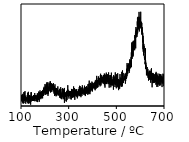
| Category | Series 0 |
|---|---|
| 100.00000000000003 | 0 |
| 100.38936261340189 | 0 |
| 100.77872522680374 | 0 |
| 101.1680878402056 | 0 |
| 101.55745045360747 | 0 |
| 101.94681306700933 | 0 |
| 102.33617568041119 | 0 |
| 102.72553829381305 | 0 |
| 103.11490090721492 | 0 |
| 103.50426352061677 | 0 |
| 103.89362613401863 | 0 |
| 104.28298874742049 | 0 |
| 104.67235136082236 | 0 |
| 105.06171397422422 | 0 |
| 105.45107658762608 | 0 |
| 105.84043920102795 | 0 |
| 106.2298018144298 | 0 |
| 106.61916442783166 | 0 |
| 107.00852704123352 | 0 |
| 107.39788965463539 | 0 |
| 107.78725226803725 | 0 |
| 108.17661488143911 | 0 |
| 108.56597749484096 | 0 |
| 108.95534010824284 | 0 |
| 109.3447027216447 | 0 |
| 109.73406533504655 | 0 |
| 110.12342794844841 | 0 |
| 110.51279056185028 | 0 |
| 110.90215317525214 | 0 |
| 111.291515788654 | 0 |
| 111.68087840205585 | 0 |
| 112.07024101545773 | 0 |
| 112.45960362885958 | 0 |
| 112.84896624226144 | 0 |
| 113.2383288556633 | 0 |
| 113.62769146906517 | 0 |
| 114.01705408246703 | 0 |
| 114.40641669586888 | 0 |
| 114.79577930927074 | 0 |
| 115.18514192267261 | 0 |
| 115.57450453607447 | 0 |
| 115.96386714947633 | 0 |
| 116.35322976287819 | 0 |
| 116.74259237628006 | 0 |
| 117.13195498968192 | 0 |
| 117.52131760308377 | 0 |
| 117.91068021648564 | 0 |
| 118.3000428298875 | 0 |
| 118.68940544328936 | 0 |
| 119.07876805669122 | 0 |
| 119.46813067009309 | 0 |
| 119.85749328349495 | 0 |
| 120.2468558968968 | 0 |
| 120.63621851029866 | 0 |
| 121.02558112370053 | 0 |
| 121.41494373710239 | 0 |
| 121.80430635050425 | 0 |
| 122.1936689639061 | 0 |
| 122.58303157730798 | 0 |
| 122.97239419070984 | 0 |
| 123.36175680411169 | 0 |
| 123.75111941751355 | 0 |
| 124.14048203091542 | 0 |
| 124.52984464431728 | 0 |
| 124.91920725771914 | 0 |
| 125.308569871121 | 0 |
| 125.69793248452287 | 0 |
| 126.08729509792472 | 0 |
| 126.47665771132658 | 0 |
| 126.86602032472844 | 0 |
| 127.25538293813031 | 0 |
| 127.64474555153217 | 0 |
| 128.03410816493403 | 0 |
| 128.42347077833588 | 0 |
| 128.81283339173774 | 0 |
| 129.20219600513963 | 0 |
| 129.59155861854148 | 0 |
| 129.98092123194334 | 0 |
| 130.3702838453452 | 0 |
| 130.75964645874706 | 0 |
| 131.1490090721489 | 0 |
| 131.53837168555077 | 0 |
| 131.92773429895263 | 0 |
| 132.31709691235451 | 0 |
| 132.70645952575637 | 0 |
| 133.09582213915823 | 0 |
| 133.4851847525601 | 0 |
| 133.87454736596194 | 0 |
| 134.2639099793638 | 0 |
| 134.65327259276566 | 0 |
| 135.04263520616752 | 0 |
| 135.4319978195694 | 0 |
| 135.82136043297126 | 0 |
| 136.21072304637312 | 0 |
| 136.60008565977498 | 0 |
| 136.98944827317683 | 0 |
| 137.3788108865787 | 0 |
| 137.76817349998055 | 0 |
| 138.1575361133824 | 0 |
| 138.5468987267843 | 0 |
| 138.93626134018615 | 0 |
| 139.325623953588 | 0 |
| 139.71498656698986 | 0 |
| 140.10434918039172 | 0 |
| 140.49371179379358 | 0 |
| 140.88307440719544 | 0 |
| 141.27243702059732 | 0 |
| 141.66179963399918 | 0 |
| 142.05116224740104 | 0 |
| 142.4405248608029 | 0 |
| 142.82988747420475 | 0 |
| 143.2192500876066 | 0 |
| 143.60861270100847 | 0 |
| 143.99797531441033 | 0 |
| 144.3873379278122 | 0 |
| 144.77670054121407 | 0 |
| 145.16606315461593 | 0 |
| 145.55542576801778 | 0 |
| 145.94478838141964 | 0 |
| 146.3341509948215 | 0 |
| 146.72351360822336 | 0 |
| 147.1128762216252 | 0 |
| 147.5022388350271 | 0 |
| 147.89160144842896 | 0 |
| 148.28096406183082 | 0 |
| 148.67032667523267 | 0 |
| 149.05968928863453 | 0 |
| 149.4490519020364 | 0 |
| 149.83841451543825 | 0 |
| 150.2277771288401 | 0 |
| 150.617139742242 | 0 |
| 151.00650235564385 | 0 |
| 151.3958649690457 | 0 |
| 151.78522758244756 | 0 |
| 152.17459019584942 | 0 |
| 152.56395280925128 | 0 |
| 152.95331542265313 | 0 |
| 153.34267803605502 | 0 |
| 153.73204064945688 | 0 |
| 154.12140326285873 | 0 |
| 154.5107658762606 | 0 |
| 154.90012848966245 | 0 |
| 155.2894911030643 | 0 |
| 155.67885371646616 | 0 |
| 156.06821632986802 | 0 |
| 156.4575789432699 | 0 |
| 156.84694155667177 | 0 |
| 157.23630417007362 | 0 |
| 157.62566678347548 | 0 |
| 158.01502939687734 | 0 |
| 158.4043920102792 | 0 |
| 158.79375462368105 | 0 |
| 159.1831172370829 | 0 |
| 159.5724798504848 | 0 |
| 159.96184246388665 | 0 |
| 160.3512050772885 | 0 |
| 160.74056769069037 | 0 |
| 161.12993030409223 | 0 |
| 161.51929291749408 | 0 |
| 161.90865553089594 | 0 |
| 162.2980181442978 | 0 |
| 162.68738075769969 | 0 |
| 163.07674337110154 | 0 |
| 163.4661059845034 | 0 |
| 163.85546859790526 | 0 |
| 164.24483121130712 | 0 |
| 164.63419382470897 | 0 |
| 165.02355643811083 | 0 |
| 165.41291905151272 | 0 |
| 165.80228166491457 | 0 |
| 166.19164427831643 | 0 |
| 166.5810068917183 | 0 |
| 166.97036950512015 | 0 |
| 167.359732118522 | 0 |
| 167.74909473192386 | 0 |
| 168.13845734532572 | 0 |
| 168.5278199587276 | 0 |
| 168.91718257212946 | 0 |
| 169.30654518553132 | 0 |
| 169.69590779893318 | 0 |
| 170.08527041233503 | 0 |
| 170.4746330257369 | 0 |
| 170.86399563913875 | 0 |
| 171.2533582525406 | 0 |
| 171.6427208659425 | 0 |
| 172.03208347934435 | 0 |
| 172.4214460927462 | 0 |
| 172.81080870614807 | 0 |
| 173.20017131954992 | 0 |
| 173.58953393295178 | 0 |
| 173.97889654635364 | 0 |
| 174.3682591597555 | 0 |
| 174.75762177315738 | 0 |
| 175.14698438655924 | 0 |
| 175.5363469999611 | 0 |
| 175.92570961336295 | 0 |
| 176.3150722267648 | 0 |
| 176.70443484016667 | 0 |
| 177.09379745356853 | 0 |
| 177.4831600669704 | 0 |
| 177.87252268037227 | 0 |
| 178.26188529377413 | 0 |
| 178.65124790717599 | 0 |
| 179.04061052057784 | 0 |
| 179.4299731339797 | 0 |
| 179.81933574738156 | 0 |
| 180.20869836078342 | 0 |
| 180.5980609741853 | 0 |
| 180.98742358758716 | 0 |
| 181.37678620098902 | 0 |
| 181.76614881439087 | 0 |
| 182.15551142779273 | 0 |
| 182.5448740411946 | 0 |
| 182.93423665459645 | 0 |
| 183.3235992679983 | 0 |
| 183.7129618814002 | 0 |
| 184.10232449480205 | 0 |
| 184.4916871082039 | 0 |
| 184.88104972160576 | 0 |
| 185.27041233500762 | 0 |
| 185.65977494840948 | 0 |
| 186.04913756181134 | 0 |
| 186.4385001752132 | 0 |
| 186.82786278861508 | 0 |
| 187.21722540201694 | 0 |
| 187.6065880154188 | 0 |
| 187.99595062882065 | 0 |
| 188.3853132422225 | 0 |
| 188.77467585562437 | 0 |
| 189.16403846902622 | 0 |
| 189.5534010824281 | 0 |
| 189.94276369582997 | 0 |
| 190.33212630923182 | 0 |
| 190.72148892263368 | 0 |
| 191.11085153603554 | 0 |
| 191.5002141494374 | 0 |
| 191.88957676283925 | 0 |
| 192.2789393762411 | 0 |
| 192.668301989643 | 0 |
| 193.05766460304486 | 0 |
| 193.4470272164467 | 0 |
| 193.83638982984857 | 0 |
| 194.22575244325043 | 0 |
| 194.6151150566523 | 0 |
| 195.00447767005414 | 0 |
| 195.393840283456 | 0 |
| 195.7832028968579 | 0 |
| 196.17256551025974 | 0 |
| 196.5619281236616 | 0 |
| 196.95129073706346 | 0 |
| 197.34065335046532 | 0 |
| 197.73001596386717 | 0 |
| 198.11937857726903 | 0 |
| 198.5087411906709 | 0 |
| 198.89810380407278 | 0 |
| 199.28746641747463 | 0 |
| 199.6768290308765 | 0 |
| 200.06619164427835 | 0 |
| 200.4555542576802 | 0 |
| 200.84491687108206 | 0 |
| 201.23427948448392 | 0 |
| 201.6236420978858 | 0 |
| 202.01300471128766 | 0 |
| 202.40236732468952 | 0 |
| 202.79172993809138 | 0 |
| 203.18109255149324 | 0 |
| 203.5704551648951 | 0 |
| 203.95981777829695 | 0 |
| 204.3491803916988 | 0 |
| 204.7385430051007 | 0 |
| 205.12790561850255 | 0 |
| 205.5172682319044 | 0 |
| 205.90663084530627 | 0 |
| 206.29599345870812 | 0 |
| 206.68535607210998 | 0 |
| 207.07471868551184 | 0 |
| 207.4640812989137 | 0 |
| 207.85344391231558 | 0 |
| 208.24280652571744 | 0 |
| 208.6321691391193 | 0 |
| 209.02153175252116 | 0 |
| 209.410894365923 | 0 |
| 209.80025697932487 | 0 |
| 210.18961959272673 | 0 |
| 210.5789822061286 | 0 |
| 210.96834481953047 | 0 |
| 211.35770743293233 | 0 |
| 211.7470700463342 | 0 |
| 212.13643265973604 | 0 |
| 212.5257952731379 | 0 |
| 212.91515788653976 | 0 |
| 213.30452049994162 | 0 |
| 213.6938831133435 | 0 |
| 214.08324572674536 | 0 |
| 214.47260834014722 | 0 |
| 214.86197095354908 | 0 |
| 215.25133356695093 | 0 |
| 215.6406961803528 | 0 |
| 216.03005879375465 | 0 |
| 216.4194214071565 | 0 |
| 216.8087840205584 | 0 |
| 217.19814663396025 | 0 |
| 217.5875092473621 | 0 |
| 217.97687186076396 | 0 |
| 218.36623447416582 | 0 |
| 218.75559708756768 | 0 |
| 219.14495970096954 | 0 |
| 219.5343223143714 | 0 |
| 219.92368492777328 | 0 |
| 220.31304754117514 | 0 |
| 220.702410154577 | 0 |
| 221.09177276797885 | 0 |
| 221.4811353813807 | 0 |
| 221.87049799478257 | 0 |
| 222.25986060818443 | 0 |
| 222.64922322158628 | 0 |
| 223.03858583498817 | 0 |
| 223.42794844839003 | 0 |
| 223.81731106179188 | 0 |
| 224.20667367519374 | 0 |
| 224.5960362885956 | 0 |
| 224.98539890199746 | 0 |
| 225.3747615153993 | 0 |
| 225.7641241288012 | 0 |
| 226.15348674220306 | 0 |
| 226.54284935560491 | 0 |
| 226.93221196900677 | 0 |
| 227.32157458240863 | 0 |
| 227.7109371958105 | 0 |
| 228.10029980921234 | 0 |
| 228.4896624226142 | 0 |
| 228.8790250360161 | 0 |
| 229.26838764941795 | 0 |
| 229.6577502628198 | 0 |
| 230.04711287622166 | 0 |
| 230.43647548962352 | 0 |
| 230.82583810302538 | 0 |
| 231.21520071642723 | 0 |
| 231.6045633298291 | 0 |
| 231.99392594323098 | 0 |
| 232.38328855663283 | 0 |
| 232.7726511700347 | 0 |
| 233.16201378343655 | 0 |
| 233.5513763968384 | 0 |
| 233.94073901024026 | 0 |
| 234.33010162364212 | 0 |
| 234.71946423704398 | 0 |
| 235.10882685044587 | 0 |
| 235.49818946384772 | 0 |
| 235.88755207724958 | 0 |
| 236.27691469065144 | 0 |
| 236.6662773040533 | 0 |
| 237.05563991745515 | 0 |
| 237.445002530857 | 0 |
| 237.8343651442589 | 0 |
| 238.22372775766075 | 0 |
| 238.6130903710626 | 0 |
| 239.00245298446447 | 0 |
| 239.39181559786633 | 0 |
| 239.78117821126818 | 0 |
| 240.17054082467004 | 0 |
| 240.5599034380719 | 0 |
| 240.94926605147378 | 0 |
| 241.33862866487564 | 0 |
| 241.7279912782775 | 0 |
| 242.11735389167936 | 0 |
| 242.50671650508122 | 0 |
| 242.89607911848307 | 0 |
| 243.28544173188493 | 0 |
| 243.6748043452868 | 0 |
| 244.06416695868867 | 0 |
| 244.45352957209053 | 0 |
| 244.8428921854924 | 0 |
| 245.23225479889425 | 0 |
| 245.6216174122961 | 0 |
| 246.01098002569796 | 0 |
| 246.40034263909982 | 0 |
| 246.78970525250168 | 0 |
| 247.17906786590356 | 0 |
| 247.56843047930542 | 0 |
| 247.95779309270728 | 0 |
| 248.34715570610913 | 0 |
| 248.736518319511 | 0 |
| 249.12588093291285 | 0 |
| 249.5152435463147 | 0 |
| 249.9046061597166 | 0 |
| 250.29396877311845 | 0 |
| 250.6833313865203 | 0 |
| 251.07269399992217 | 0 |
| 251.46205661332402 | 0 |
| 251.85141922672588 | 0 |
| 252.24078184012774 | 0 |
| 252.6301444535296 | 0 |
| 253.01950706693148 | 0 |
| 253.40886968033334 | 0 |
| 253.7982322937352 | 0 |
| 254.18759490713705 | 0 |
| 254.5769575205389 | 0 |
| 254.96632013394077 | 0 |
| 255.35568274734263 | 0 |
| 255.74504536074448 | 0 |
| 256.13440797414637 | 0 |
| 256.5237705875482 | 0 |
| 256.9131332009501 | 0 |
| 257.3024958143519 | 0 |
| 257.6918584277538 | 0 |
| 258.0812210411557 | 0 |
| 258.4705836545575 | 0 |
| 258.8599462679594 | 0 |
| 259.24930888136123 | 0 |
| 259.6386714947631 | 0 |
| 260.02803410816495 | 0 |
| 260.41739672156683 | 0 |
| 260.8067593349687 | 0 |
| 261.19612194837055 | 0 |
| 261.58548456177243 | 0 |
| 261.97484717517426 | 0 |
| 262.36420978857615 | 0 |
| 262.753572401978 | 0 |
| 263.14293501537986 | 0 |
| 263.53229762878175 | 0 |
| 263.9216602421836 | 0 |
| 264.31102285558546 | 0 |
| 264.7003854689873 | 0 |
| 265.0897480823892 | 0 |
| 265.479110695791 | 0 |
| 265.8684733091929 | 0 |
| 266.2578359225947 | 0 |
| 266.6471985359966 | 0 |
| 267.0365611493985 | 0 |
| 267.4259237628003 | 0 |
| 267.8152863762022 | 0 |
| 268.20464898960404 | 0 |
| 268.5940116030059 | 0 |
| 268.98337421640775 | 0 |
| 269.37273682980964 | 0 |
| 269.7620994432115 | 0 |
| 270.15146205661335 | 0 |
| 270.54082467001524 | 0 |
| 270.93018728341707 | 0 |
| 271.31954989681896 | 0 |
| 271.7089125102208 | 0 |
| 272.09827512362267 | 0 |
| 272.4876377370245 | 0 |
| 272.8770003504264 | 0 |
| 273.26636296382827 | 0 |
| 273.6557255772301 | 0 |
| 274.045088190632 | 0 |
| 274.4344508040338 | 0 |
| 274.8238134174357 | 0 |
| 275.21317603083753 | 0 |
| 275.6025386442394 | 0 |
| 275.9919012576413 | 0 |
| 276.38126387104313 | 0 |
| 276.770626484445 | 0 |
| 277.15998909784685 | 0 |
| 277.54935171124873 | 0 |
| 277.93871432465056 | 0 |
| 278.32807693805245 | 0 |
| 278.71743955145433 | 0 |
| 279.10680216485616 | 0 |
| 279.49616477825805 | 0 |
| 279.8855273916599 | 0 |
| 280.27489000506176 | 0 |
| 280.6642526184636 | 0 |
| 281.0536152318655 | 0 |
| 281.4429778452673 | 0 |
| 281.8323404586692 | 0 |
| 282.2217030720711 | 0 |
| 282.6110656854729 | 0 |
| 283.0004282988748 | 0 |
| 283.3897909122766 | 0 |
| 283.7791535256785 | 0 |
| 284.16851613908034 | 0 |
| 284.5578787524822 | 0 |
| 284.9472413658841 | 0 |
| 285.33660397928594 | 0 |
| 285.7259665926878 | 0 |
| 286.11532920608965 | 0 |
| 286.50469181949154 | 0 |
| 286.89405443289337 | 0 |
| 287.28341704629526 | 0 |
| 287.67277965969714 | 0 |
| 288.06214227309897 | 0 |
| 288.45150488650086 | 0 |
| 288.8408674999027 | 0 |
| 289.2302301133046 | 0 |
| 289.6195927267064 | 0 |
| 290.0089553401083 | 0 |
| 290.3983179535101 | 0 |
| 290.787680566912 | 0 |
| 291.1770431803139 | 0 |
| 291.5664057937157 | 0 |
| 291.9557684071176 | 0 |
| 292.34513102051943 | 0 |
| 292.7344936339213 | 0 |
| 293.12385624732315 | 0 |
| 293.51321886072503 | 0 |
| 293.9025814741269 | 0 |
| 294.29194408752875 | 0 |
| 294.68130670093063 | 0 |
| 295.07066931433246 | 0 |
| 295.46003192773435 | 0 |
| 295.8493945411362 | 0 |
| 296.23875715453806 | 0 |
| 296.6281197679399 | 0 |
| 297.0174823813418 | 0 |
| 297.40684499474366 | 0 |
| 297.7962076081455 | 0 |
| 298.1855702215474 | 0 |
| 298.5749328349492 | 0 |
| 298.9642954483511 | 0 |
| 299.3536580617529 | 0 |
| 299.7430206751548 | 0 |
| 300.1323832885567 | 0 |
| 300.5217459019585 | 0 |
| 300.9111085153604 | 0 |
| 301.30047112876224 | 0 |
| 301.6898337421641 | 0 |
| 302.07919635556595 | 0 |
| 302.46855896896784 | 0 |
| 302.8579215823697 | 0 |
| 303.24728419577156 | 0 |
| 303.63664680917344 | 0 |
| 304.02600942257527 | 0 |
| 304.41537203597716 | 0 |
| 304.804734649379 | 0 |
| 305.1940972627809 | 0 |
| 305.5834598761827 | 0 |
| 305.9728224895846 | 0 |
| 306.3621851029865 | 0 |
| 306.7515477163883 | 0 |
| 307.1409103297902 | 0 |
| 307.530272943192 | 0 |
| 307.9196355565939 | 0 |
| 308.30899816999573 | 0 |
| 308.6983607833976 | 0 |
| 309.0877233967995 | 0 |
| 309.47708601020133 | 0 |
| 309.8664486236032 | 0 |
| 310.25581123700505 | 0 |
| 310.64517385040693 | 0 |
| 311.03453646380876 | 0 |
| 311.42389907721065 | 0 |
| 311.81326169061253 | 0 |
| 312.20262430401436 | 0 |
| 312.59198691741625 | 0 |
| 312.9813495308181 | 0 |
| 313.37071214421997 | 0 |
| 313.7600747576218 | 0 |
| 314.1494373710237 | 0 |
| 314.5387999844255 | 0 |
| 314.9281625978274 | 0 |
| 315.3175252112293 | 0 |
| 315.7068878246311 | 0 |
| 316.096250438033 | 0 |
| 316.4856130514348 | 0 |
| 316.8749756648367 | 0 |
| 317.26433827823854 | 0 |
| 317.6537008916404 | 0 |
| 318.0430635050423 | 0 |
| 318.43242611844414 | 0 |
| 318.821788731846 | 0 |
| 319.21115134524786 | 0 |
| 319.60051395864974 | 0 |
| 319.98987657205157 | 0 |
| 320.37923918545346 | 0 |
| 320.7686017988553 | 0 |
| 321.1579644122572 | 0 |
| 321.54732702565906 | 0 |
| 321.9366896390609 | 0 |
| 322.3260522524628 | 0 |
| 322.7154148658646 | 0 |
| 323.1047774792665 | 0 |
| 323.4941400926683 | 0 |
| 323.8835027060702 | 0 |
| 324.2728653194721 | 0 |
| 324.6622279328739 | 0 |
| 325.0515905462758 | 0 |
| 325.44095315967763 | 0 |
| 325.8303157730795 | 0 |
| 326.21967838648135 | 0 |
| 326.60904099988323 | 0 |
| 326.9984036132851 | 0 |
| 327.38776622668695 | 0 |
| 327.77712884008884 | 0 |
| 328.16649145349066 | 0 |
| 328.55585406689255 | 0 |
| 328.9452166802944 | 0 |
| 329.33457929369627 | 0 |
| 329.7239419070981 | 0 |
| 330.1133045205 | 0 |
| 330.50266713390187 | 0 |
| 330.8920297473037 | 0 |
| 331.2813923607056 | 0 |
| 331.6707549741074 | 0 |
| 332.0601175875093 | 0 |
| 332.4494802009111 | 0 |
| 332.838842814313 | 0 |
| 333.2282054277149 | 0 |
| 333.6175680411167 | 0 |
| 334.0069306545186 | 0 |
| 334.39629326792044 | 0 |
| 334.7856558813223 | 0 |
| 335.17501849472416 | 0 |
| 335.56438110812604 | 0 |
| 335.9537437215279 | 0 |
| 336.34310633492976 | 0 |
| 336.73246894833164 | 0 |
| 337.1218315617335 | 0 |
| 337.51119417513536 | 0 |
| 337.9005567885372 | 0 |
| 338.2899194019391 | 0 |
| 338.6792820153409 | 0 |
| 339.0686446287428 | 0 |
| 339.4580072421447 | 0 |
| 339.8473698555465 | 0 |
| 340.2367324689484 | 0 |
| 340.6260950823502 | 0 |
| 341.0154576957521 | 0 |
| 341.40482030915393 | 0 |
| 341.7941829225558 | 0 |
| 342.1835455359577 | 0 |
| 342.57290814935953 | 0 |
| 342.9622707627614 | 0 |
| 343.35163337616325 | 0 |
| 343.74099598956514 | 0 |
| 344.13035860296696 | 0 |
| 344.51972121636885 | 0 |
| 344.9090838297707 | 0 |
| 345.29844644317257 | 0 |
| 345.68780905657445 | 0 |
| 346.0771716699763 | 0 |
| 346.46653428337817 | 0 |
| 346.85589689678 | 0 |
| 347.2452595101819 | 0 |
| 347.6346221235837 | 0 |
| 348.0239847369856 | 0 |
| 348.4133473503875 | 0 |
| 348.8027099637893 | 0 |
| 349.1920725771912 | 0 |
| 349.581435190593 | 0 |
| 349.9707978039949 | 0 |
| 350.36016041739674 | 0 |
| 350.7495230307986 | 0 |
| 351.1388856442005 | 0 |
| 351.52824825760234 | 0 |
| 351.91761087100423 | 0 |
| 352.30697348440606 | 0 |
| 352.69633609780794 | 0 |
| 353.0856987112098 | 0 |
| 353.47506132461166 | 0 |
| 353.8644239380135 | 0 |
| 354.2537865514154 | 0 |
| 354.64314916481726 | 0 |
| 355.0325117782191 | 0 |
| 355.421874391621 | 0 |
| 355.8112370050228 | 0 |
| 356.2005996184247 | 0 |
| 356.5899622318265 | 0 |
| 356.9793248452284 | 0 |
| 357.3686874586303 | 0 |
| 357.7580500720321 | 0 |
| 358.147412685434 | 0 |
| 358.53677529883583 | 0 |
| 358.9261379122377 | 0 |
| 359.31550052563955 | 0 |
| 359.70486313904144 | 0 |
| 360.0942257524433 | 0 |
| 360.48358836584515 | 0 |
| 360.87295097924704 | 0 |
| 361.26231359264887 | 0 |
| 361.65167620605075 | 0 |
| 362.0410388194526 | 0 |
| 362.43040143285447 | 0 |
| 362.8197640462563 | 0 |
| 363.2091266596582 | 0 |
| 363.59848927306007 | 0 |
| 363.9878518864619 | 0 |
| 364.3772144998638 | 0 |
| 364.7665771132656 | 0 |
| 365.1559397266675 | 0 |
| 365.5453023400693 | 0 |
| 365.9346649534712 | 0 |
| 366.3240275668731 | 0 |
| 366.7133901802749 | 0 |
| 367.1027527936768 | 0 |
| 367.49211540707864 | 0 |
| 367.88147802048053 | 0 |
| 368.27084063388236 | 0 |
| 368.66020324728424 | 0 |
| 369.0495658606861 | 0 |
| 369.43892847408796 | 0 |
| 369.82829108748984 | 0 |
| 370.2176537008917 | 0 |
| 370.60701631429356 | 0 |
| 370.9963789276954 | 0 |
| 371.3857415410973 | 0 |
| 371.7751041544991 | 0 |
| 372.164466767901 | 0 |
| 372.5538293813029 | 0 |
| 372.9431919947047 | 0 |
| 373.3325546081066 | 0 |
| 373.7219172215084 | 0 |
| 374.1112798349103 | 0 |
| 374.50064244831214 | 0 |
| 374.890005061714 | 0 |
| 375.2793676751159 | 0 |
| 375.66873028851774 | 0 |
| 376.0580929019196 | 0 |
| 376.44745551532145 | 0 |
| 376.83681812872334 | 0 |
| 377.22618074212517 | 0 |
| 377.61554335552705 | 0 |
| 378.0049059689289 | 0 |
| 378.39426858233077 | 0 |
| 378.78363119573265 | 0 |
| 379.1729938091345 | 0 |
| 379.56235642253637 | 0 |
| 379.9517190359382 | 0 |
| 380.3410816493401 | 0 |
| 380.7304442627419 | 0 |
| 381.1198068761438 | 0 |
| 381.5091694895457 | 0 |
| 381.8985321029475 | 0 |
| 382.2878947163494 | 0 |
| 382.6772573297512 | 0 |
| 383.0666199431531 | 0 |
| 383.45598255655494 | 0 |
| 383.84534516995683 | 0 |
| 384.2347077833587 | 0 |
| 384.62407039676054 | 0 |
| 385.01343301016243 | 0 |
| 385.40279562356426 | 0 |
| 385.79215823696615 | 0 |
| 386.181520850368 | 0 |
| 386.57088346376986 | 0 |
| 386.9602460771717 | 0 |
| 387.3496086905736 | 0 |
| 387.73897130397546 | 0 |
| 388.1283339173773 | 0 |
| 388.5176965307792 | 0 |
| 388.907059144181 | 0 |
| 389.2964217575829 | 0 |
| 389.6857843709847 | 0 |
| 390.0751469843866 | 0 |
| 390.4645095977885 | 0 |
| 390.8538722111903 | 0 |
| 391.2432348245922 | 0 |
| 391.63259743799404 | 0 |
| 392.0219600513959 | 0 |
| 392.41132266479775 | 0 |
| 392.80068527819964 | 0 |
| 393.19004789160147 | 0 |
| 393.57941050500335 | 0 |
| 393.96877311840524 | 0 |
| 394.35813573180707 | 0 |
| 394.74749834520895 | 0 |
| 395.1368609586108 | 0 |
| 395.52622357201267 | 0 |
| 395.9155861854145 | 0 |
| 396.3049487988164 | 0 |
| 396.69431141221827 | 0 |
| 397.0836740256201 | 0 |
| 397.473036639022 | 0 |
| 397.8623992524238 | 0 |
| 398.2517618658257 | 0 |
| 398.6411244792275 | 0 |
| 399.03048709262936 | 0 |
| 399.41984970603124 | 0 |
| 399.8092123194331 | 0 |
| 400.19857493283496 | 0 |
| 400.5879375462368 | 0 |
| 400.9773001596387 | 0 |
| 401.36666277304056 | 0 |
| 401.7560253864424 | 0 |
| 402.1453879998443 | 0 |
| 402.5347506132461 | 0 |
| 402.924113226648 | 0 |
| 403.3134758400498 | 0 |
| 403.7028384534517 | 0 |
| 404.0922010668536 | 0 |
| 404.4815636802554 | 0 |
| 404.8709262936573 | 0 |
| 405.26028890705913 | 0 |
| 405.649651520461 | 0 |
| 406.03901413386285 | 0 |
| 406.42837674726474 | 0 |
| 406.81773936066656 | 0 |
| 407.20710197406845 | 0 |
| 407.59646458747034 | 0 |
| 407.98582720087217 | 0 |
| 408.37518981427405 | 0 |
| 408.7645524276759 | 0 |
| 409.15391504107777 | 0 |
| 409.5432776544796 | 0 |
| 409.9326402678815 | 0 |
| 410.32200288128337 | 0 |
| 410.7113654946852 | 0 |
| 411.1007281080871 | 0 |
| 411.4900907214889 | 0 |
| 411.8794533348908 | 0 |
| 412.2688159482926 | 0 |
| 412.6581785616945 | 0 |
| 413.0475411750964 | 0 |
| 413.4369037884982 | 0 |
| 413.8262664019001 | 0 |
| 414.21562901530194 | 0 |
| 414.60499162870383 | 0 |
| 414.99435424210566 | 0 |
| 415.38371685550754 | 0 |
| 415.7730794689094 | 0 |
| 416.16244208231126 | 0 |
| 416.55180469571314 | 0 |
| 416.941167309115 | 0 |
| 417.33052992251686 | 0 |
| 417.7198925359187 | 0 |
| 418.1092551493206 | 0 |
| 418.4986177627224 | 0 |
| 418.8879803761243 | 0 |
| 419.2773429895262 | 0 |
| 419.666705602928 | 0 |
| 420.0560682163299 | 0 |
| 420.4454308297317 | 0 |
| 420.8347934431336 | 0 |
| 421.22415605653543 | 0 |
| 421.6135186699373 | 0 |
| 422.00288128333915 | 0 |
| 422.39224389674104 | 0 |
| 422.7816065101429 | 0 |
| 423.17096912354475 | 0 |
| 423.56033173694664 | 0 |
| 423.94969435034847 | 0 |
| 424.33905696375035 | 0 |
| 424.7284195771522 | 0 |
| 425.11778219055407 | 0 |
| 425.50714480395595 | 0 |
| 425.8965074173578 | 0 |
| 426.28587003075967 | 0 |
| 426.6752326441615 | 0 |
| 427.0645952575634 | 0 |
| 427.4539578709652 | 0 |
| 427.8433204843671 | 0 |
| 428.232683097769 | 0 |
| 428.6220457111708 | 0 |
| 429.0114083245727 | 0 |
| 429.4007709379745 | 0 |
| 429.7901335513764 | 0 |
| 430.17949616477824 | 0 |
| 430.56885877818013 | 0 |
| 430.95822139158196 | 0 |
| 431.34758400498384 | 0 |
| 431.73694661838573 | 0 |
| 432.12630923178756 | 0 |
| 432.51567184518944 | 0 |
| 432.9050344585913 | 0 |
| 433.29439707199316 | 0 |
| 433.683759685395 | 0 |
| 434.0731222987969 | 0 |
| 434.46248491219876 | 0 |
| 434.8518475256006 | 0 |
| 435.2412101390025 | 0 |
| 435.6305727524043 | 0 |
| 436.0199353658062 | 0 |
| 436.409297979208 | 0 |
| 436.7986605926099 | 0 |
| 437.1880232060118 | 0 |
| 437.5773858194136 | 0 |
| 437.9667484328155 | 0 |
| 438.35611104621734 | 0 |
| 438.7454736596192 | 0 |
| 439.13483627302105 | 0 |
| 439.52419888642294 | 0 |
| 439.91356149982477 | 0 |
| 440.30292411322665 | 0 |
| 440.69228672662854 | 0 |
| 441.08164934003037 | 0 |
| 441.47101195343225 | 0 |
| 441.8603745668341 | 0 |
| 442.24973718023597 | 0 |
| 442.6390997936378 | 0 |
| 443.0284624070397 | 0 |
| 443.41782502044157 | 0 |
| 443.8071876338434 | 0 |
| 444.1965502472453 | 0 |
| 444.5859128606471 | 0 |
| 444.975275474049 | 0 |
| 445.3646380874508 | 0 |
| 445.7540007008527 | 0 |
| 446.14336331425454 | 0 |
| 446.53272592765643 | 0 |
| 446.9220885410583 | 0 |
| 447.31145115446014 | 0 |
| 447.70081376786203 | 0 |
| 448.09017638126386 | 0 |
| 448.47953899466575 | 0 |
| 448.8689016080676 | 0 |
| 449.25826422146946 | 0 |
| 449.64762683487135 | 0 |
| 450.0369894482732 | 0 |
| 450.42635206167506 | 0 |
| 450.8157146750769 | 0 |
| 451.2050772884788 | 0 |
| 451.5944399018806 | 0 |
| 451.9838025152825 | 0 |
| 452.3731651286844 | 0 |
| 452.7625277420862 | 0 |
| 453.1518903554881 | 0 |
| 453.5412529688899 | 0 |
| 453.9306155822918 | 0 |
| 454.31997819569364 | 0 |
| 454.7093408090955 | 0 |
| 455.09870342249735 | 0 |
| 455.48806603589924 | 0 |
| 455.8774286493011 | 0 |
| 456.26679126270295 | 0 |
| 456.65615387610484 | 0 |
| 457.04551648950667 | 0 |
| 457.43487910290855 | 0 |
| 457.8242417163104 | 0 |
| 458.21360432971227 | 0 |
| 458.60296694311415 | 0 |
| 458.992329556516 | 0 |
| 459.38169216991787 | 0 |
| 459.7710547833197 | 0 |
| 460.1604173967216 | 0 |
| 460.5497800101234 | 0 |
| 460.9391426235253 | 0 |
| 461.3285052369272 | 0 |
| 461.717867850329 | 0 |
| 462.1072304637309 | 0 |
| 462.49659307713273 | 0 |
| 462.8859556905346 | 0 |
| 463.27531830393644 | 0 |
| 463.66468091733833 | 0 |
| 464.05404353074016 | 0 |
| 464.44340614414205 | 0 |
| 464.83276875754393 | 0 |
| 465.22213137094576 | 0 |
| 465.61149398434765 | 0 |
| 466.0008565977495 | 0 |
| 466.39021921115136 | 0 |
| 466.7795818245532 | 0 |
| 467.1689444379551 | 0 |
| 467.55830705135696 | 0 |
| 467.9476696647588 | 0 |
| 468.3370322781607 | 0 |
| 468.7263948915625 | 0 |
| 469.1157575049644 | 0 |
| 469.5051201183662 | 0 |
| 469.8944827317681 | 0 |
| 470.28384534516994 | 0 |
| 470.6732079585718 | 0 |
| 471.0625705719737 | 0 |
| 471.45193318537554 | 0 |
| 471.8412957987774 | 0 |
| 472.23065841217925 | 0 |
| 472.62002102558114 | 0 |
| 473.00938363898297 | 0 |
| 473.39874625238485 | 0 |
| 473.78810886578674 | 0 |
| 474.17747147918857 | 0 |
| 474.56683409259045 | 0 |
| 474.9561967059923 | 0 |
| 475.34555931939417 | 0 |
| 475.734921932796 | 0 |
| 476.1242845461979 | 0 |
| 476.51364715959977 | 0 |
| 476.9030097730016 | 0 |
| 477.2923723864035 | 0 |
| 477.6817349998053 | 0 |
| 478.0710976132072 | 0 |
| 478.46046022660903 | 0 |
| 478.8498228400109 | 0 |
| 479.23918545341274 | 0 |
| 479.62854806681463 | 0 |
| 480.0179106802165 | 0 |
| 480.40727329361835 | 0 |
| 480.79663590702023 | 0 |
| 481.18599852042206 | 0 |
| 481.57536113382395 | 0 |
| 481.9647237472258 | 0 |
| 482.35408636062766 | 0 |
| 482.74344897402955 | 0 |
| 483.1328115874314 | 0 |
| 483.52217420083326 | 0 |
| 483.9115368142351 | 0 |
| 484.300899427637 | 0 |
| 484.6902620410388 | 0 |
| 485.0796246544407 | 0 |
| 485.4689872678426 | 0 |
| 485.8583498812444 | 0 |
| 486.2477124946463 | 0 |
| 486.6370751080481 | 0 |
| 487.02643772145 | 0 |
| 487.41580033485184 | 0 |
| 487.8051629482537 | 0 |
| 488.19452556165555 | 0 |
| 488.58388817505744 | 0 |
| 488.9732507884593 | 0 |
| 489.36261340186115 | 0 |
| 489.75197601526304 | 0 |
| 490.14133862866487 | 0 |
| 490.53070124206675 | 0 |
| 490.9200638554686 | 0 |
| 491.30942646887047 | 0 |
| 491.69878908227236 | 0 |
| 492.0881516956742 | 0 |
| 492.47751430907607 | 0 |
| 492.8668769224779 | 0 |
| 493.2562395358798 | 0 |
| 493.6456021492816 | 0 |
| 494.0349647626835 | 0 |
| 494.42432737608533 | 0 |
| 494.8136899894872 | 0 |
| 495.2030526028891 | 0 |
| 495.59241521629093 | 0 |
| 495.9817778296928 | 0 |
| 496.37114044309465 | 0 |
| 496.76050305649653 | 0 |
| 497.14986566989836 | 0 |
| 497.53922828330025 | 0 |
| 497.92859089670213 | 0 |
| 498.31795351010396 | 0 |
| 498.70731612350585 | 0 |
| 499.0966787369077 | 0 |
| 499.48604135030956 | 0 |
| 499.8754039637114 | 0 |
| 500.2647665771133 | 0 |
| 500.65412919051516 | 0 |
| 501.043491803917 | 0 |
| 501.4328544173189 | 0 |
| 501.8222170307207 | 0 |
| 502.2115796441226 | 0 |
| 502.6009422575244 | 0 |
| 502.9903048709263 | 0 |
| 503.37966748432814 | 0 |
| 503.76903009773 | 0 |
| 504.1583927111319 | 0 |
| 504.54775532453374 | 0 |
| 504.9371179379356 | 0 |
| 505.32648055133745 | 0 |
| 505.71584316473934 | 0 |
| 506.10520577814117 | 0 |
| 506.49456839154305 | 0 |
| 506.88393100494494 | 0 |
| 507.27329361834677 | 0 |
| 507.66265623174866 | 0 |
| 508.0520188451505 | 0 |
| 508.44138145855237 | 0 |
| 508.8307440719542 | 0 |
| 509.2201066853561 | 0 |
| 509.609469298758 | 0 |
| 509.9988319121598 | 0 |
| 510.3881945255617 | 0 |
| 510.7775571389635 | 0 |
| 511.1669197523654 | 0 |
| 511.55628236576723 | 0 |
| 511.9456449791691 | 0 |
| 512.335007592571 | 0 |
| 512.7243702059728 | 0 |
| 513.1137328193747 | 0 |
| 513.5030954327766 | 0 |
| 513.8924580461784 | 0 |
| 514.2818206595803 | 0 |
| 514.6711832729821 | 0 |
| 515.060545886384 | 0 |
| 515.4499084997858 | 0 |
| 515.8392711131877 | 0 |
| 516.2286337265896 | 0 |
| 516.6179963399915 | 0 |
| 517.0073589533934 | 0 |
| 517.3967215667951 | 0 |
| 517.786084180197 | 0 |
| 518.1754467935989 | 0 |
| 518.5648094070008 | 0 |
| 518.9541720204027 | 0 |
| 519.3435346338044 | 0 |
| 519.7328972472063 | 0 |
| 520.1222598606082 | 0 |
| 520.5116224740101 | 0 |
| 520.9009850874119 | 0 |
| 521.2903477008138 | 0 |
| 521.6797103142156 | 0 |
| 522.0690729276175 | 0 |
| 522.4584355410194 | 0 |
| 522.8477981544212 | 0 |
| 523.2371607678231 | 0 |
| 523.626523381225 | 0 |
| 524.0158859946268 | 0 |
| 524.4052486080286 | 0 |
| 524.7946112214305 | 0 |
| 525.1839738348324 | 0 |
| 525.5733364482343 | 0 |
| 525.9626990616362 | 0 |
| 526.3520616750379 | 0 |
| 526.7414242884398 | 0 |
| 527.1307869018417 | 0 |
| 527.5201495152436 | 0 |
| 527.9095121286455 | 0 |
| 528.2988747420472 | 0 |
| 528.6882373554491 | 0 |
| 529.077599968851 | 0 |
| 529.4669625822529 | 0 |
| 529.8563251956547 | 0 |
| 530.2456878090566 | 0 |
| 530.6350504224584 | 0 |
| 531.0244130358603 | 0 |
| 531.4137756492622 | 0 |
| 531.803138262664 | 0 |
| 532.1925008760659 | 0 |
| 532.5818634894678 | 0 |
| 532.9712261028697 | 0 |
| 533.3605887162714 | 0 |
| 533.7499513296733 | 0 |
| 534.1393139430752 | 0 |
| 534.5286765564771 | 0 |
| 534.918039169879 | 0 |
| 535.3074017832807 | 0 |
| 535.6967643966826 | 0 |
| 536.0861270100845 | 0 |
| 536.4754896234864 | 0 |
| 536.8648522368883 | 0 |
| 537.25421485029 | 0 |
| 537.6435774636919 | 0 |
| 538.0329400770938 | 0 |
| 538.4223026904957 | 0 |
| 538.8116653038975 | 0 |
| 539.2010279172994 | 0 |
| 539.5903905307013 | 0 |
| 539.9797531441031 | 0 |
| 540.369115757505 | 0 |
| 540.7584783709068 | 0 |
| 541.1478409843087 | 0 |
| 541.5372035977106 | 0 |
| 541.9265662111125 | 0 |
| 542.3159288245142 | 0 |
| 542.7052914379161 | 0 |
| 543.094654051318 | 0 |
| 543.4840166647199 | 0 |
| 543.8733792781218 | 0 |
| 544.2627418915235 | 0 |
| 544.6521045049254 | 0 |
| 545.0414671183273 | 0.001 |
| 545.4308297317292 | 0 |
| 545.8201923451311 | 0 |
| 546.2095549585329 | 0 |
| 546.5989175719347 | 0 |
| 546.9882801853366 | 0 |
| 547.3776427987385 | 0 |
| 547.7670054121403 | 0 |
| 548.1563680255422 | 0 |
| 548.5457306389441 | 0 |
| 548.935093252346 | 0 |
| 549.3244558657478 | 0 |
| 549.7138184791496 | 0 |
| 550.1031810925515 | 0.001 |
| 550.4925437059534 | 0 |
| 550.8819063193553 | 0 |
| 551.271268932757 | 0 |
| 551.6606315461589 | 0 |
| 552.0499941595608 | 0 |
| 552.4393567729627 | 0 |
| 552.8287193863646 | 0 |
| 553.2180819997664 | 0 |
| 553.6074446131682 | 0 |
| 553.9968072265701 | 0 |
| 554.386169839972 | 0 |
| 554.7755324533738 | 0 |
| 555.1648950667757 | 0 |
| 555.5542576801776 | 0 |
| 555.9436202935794 | 0.001 |
| 556.3329829069813 | 0.001 |
| 556.7223455203831 | 0.001 |
| 557.111708133785 | 0 |
| 557.5010707471869 | 0.001 |
| 557.8904333605888 | 0.001 |
| 558.2797959739906 | 0 |
| 558.6691585873924 | 0 |
| 559.0585212007943 | 0.001 |
| 559.4478838141962 | 0 |
| 559.8372464275981 | 0.001 |
| 560.2266090409998 | 0 |
| 560.6159716544017 | 0.001 |
| 561.0053342678036 | 0 |
| 561.3946968812055 | 0.001 |
| 561.7840594946074 | 0.001 |
| 562.1734221080092 | 0.001 |
| 562.562784721411 | 0.001 |
| 562.9521473348129 | 0.001 |
| 563.3415099482148 | 0 |
| 563.7308725616166 | 0.001 |
| 564.1202351750185 | 0.001 |
| 564.5095977884204 | 0.001 |
| 564.8989604018223 | 0.001 |
| 565.2883230152241 | 0.001 |
| 565.6776856286259 | 0.001 |
| 566.0670482420278 | 0.001 |
| 566.4564108554297 | 0.001 |
| 566.8457734688316 | 0.001 |
| 567.2351360822335 | 0.001 |
| 567.6244986956352 | 0.001 |
| 568.0138613090371 | 0.001 |
| 568.403223922439 | 0.001 |
| 568.7925865358409 | 0.001 |
| 569.1819491492427 | 0.001 |
| 569.5713117626445 | 0.001 |
| 569.9606743760464 | 0.001 |
| 570.3500369894483 | 0.001 |
| 570.7393996028502 | 0.001 |
| 571.128762216252 | 0.001 |
| 571.5181248296539 | 0.001 |
| 571.9074874430557 | 0.001 |
| 572.2968500564576 | 0.001 |
| 572.6862126698594 | 0.001 |
| 573.0755752832613 | 0.001 |
| 573.4649378966632 | 0.001 |
| 573.8543005100651 | 0.001 |
| 574.243663123467 | 0.001 |
| 574.6330257368687 | 0.001 |
| 575.0223883502706 | 0.001 |
| 575.4117509636725 | 0.001 |
| 575.8011135770744 | 0.001 |
| 576.1904761904763 | 0.001 |
| 576.579838803878 | 0.001 |
| 576.9692014172799 | 0.001 |
| 577.3585640306818 | 0.001 |
| 577.7479266440837 | 0.001 |
| 578.1372892574855 | 0.001 |
| 578.5266518708873 | 0.001 |
| 578.9160144842892 | 0.001 |
| 579.3053770976911 | 0.001 |
| 579.694739711093 | 0.001 |
| 580.0841023244948 | 0.001 |
| 580.4734649378967 | 0.001 |
| 580.8628275512986 | 0.001 |
| 581.2521901647004 | 0.001 |
| 581.6415527781022 | 0.001 |
| 582.0309153915041 | 0.001 |
| 582.420278004906 | 0.001 |
| 582.8096406183079 | 0.001 |
| 583.1990032317098 | 0.001 |
| 583.5883658451115 | 0.001 |
| 583.9777284585134 | 0.001 |
| 584.3670910719153 | 0.001 |
| 584.7564536853172 | 0.001 |
| 585.1458162987191 | 0.001 |
| 585.5351789121208 | 0.001 |
| 585.9245415255227 | 0.001 |
| 586.3139041389246 | 0.001 |
| 586.7032667523265 | 0.001 |
| 587.0926293657283 | 0.001 |
| 587.4819919791302 | 0.001 |
| 587.871354592532 | 0.001 |
| 588.2607172059339 | 0.001 |
| 588.6500798193358 | 0.001 |
| 589.0394424327376 | 0.001 |
| 589.4288050461395 | 0.001 |
| 589.8181676595414 | 0.001 |
| 590.2075302729432 | 0.001 |
| 590.596892886345 | 0.001 |
| 590.9862554997469 | 0.001 |
| 591.3756181131488 | 0.001 |
| 591.7649807265507 | 0.001 |
| 592.1543433399526 | 0.001 |
| 592.5437059533543 | 0.001 |
| 592.9330685667562 | 0.001 |
| 593.3224311801581 | 0.001 |
| 593.71179379356 | 0.001 |
| 594.1011564069618 | 0.001 |
| 594.4905190203636 | 0.001 |
| 594.8798816337655 | 0.001 |
| 595.2692442471674 | 0.001 |
| 595.6586068605693 | 0.001 |
| 596.0479694739711 | 0.001 |
| 596.437332087373 | 0.001 |
| 596.8266947007749 | 0.001 |
| 597.2160573141767 | 0.001 |
| 597.6054199275786 | 0.001 |
| 597.9947825409804 | 0.001 |
| 598.3841451543823 | 0.001 |
| 598.7735077677842 | 0.001 |
| 599.162870381186 | 0.001 |
| 599.5522329945878 | 0.001 |
| 599.9415956079897 | 0.001 |
| 600.3309582213916 | 0.001 |
| 600.7203208347935 | 0.001 |
| 601.1096834481954 | 0.001 |
| 601.4990460615971 | 0.001 |
| 601.888408674999 | 0.001 |
| 602.2777712884009 | 0.001 |
| 602.6671339018028 | 0.001 |
| 603.0564965152046 | 0.001 |
| 603.4458591286065 | 0.001 |
| 603.8352217420083 | 0.001 |
| 604.2245843554102 | 0.001 |
| 604.6139469688121 | 0.001 |
| 605.0033095822139 | 0.001 |
| 605.3926721956158 | 0.001 |
| 605.7820348090177 | 0.001 |
| 606.1713974224195 | 0.001 |
| 606.5607600358214 | 0.001 |
| 606.9501226492232 | 0.001 |
| 607.3394852626251 | 0.001 |
| 607.728847876027 | 0.001 |
| 608.1182104894289 | 0.001 |
| 608.5075731028306 | 0.001 |
| 608.8969357162325 | 0.001 |
| 609.2862983296344 | 0.001 |
| 609.6756609430363 | 0.001 |
| 610.0650235564382 | 0.001 |
| 610.45438616984 | 0.001 |
| 610.8437487832418 | 0.001 |
| 611.2331113966437 | 0.001 |
| 611.6224740100456 | 0.001 |
| 612.0118366234474 | 0.001 |
| 612.4011992368493 | 0.001 |
| 612.7905618502512 | 0.001 |
| 613.179924463653 | 0.001 |
| 613.5692870770549 | 0.001 |
| 613.9586496904567 | 0.001 |
| 614.3480123038586 | 0.001 |
| 614.7373749172605 | 0.001 |
| 615.1267375306624 | 0.001 |
| 615.5161001440642 | 0.001 |
| 615.905462757466 | 0.001 |
| 616.2948253708679 | 0.001 |
| 616.6841879842698 | 0.001 |
| 617.0735505976717 | 0.001 |
| 617.4629132110734 | 0.001 |
| 617.8522758244753 | 0.001 |
| 618.2416384378772 | 0.001 |
| 618.6310010512791 | 0.001 |
| 619.020363664681 | 0.001 |
| 619.4097262780828 | 0.001 |
| 619.7990888914846 | 0.001 |
| 620.1884515048865 | 0.001 |
| 620.5778141182884 | 0 |
| 620.9671767316902 | 0.001 |
| 621.3565393450921 | 0 |
| 621.745901958494 | 0 |
| 622.1352645718958 | 0.001 |
| 622.5246271852977 | 0 |
| 622.9139897986995 | 0.001 |
| 623.3033524121014 | 0 |
| 623.6927150255033 | 0 |
| 624.0820776389052 | 0.001 |
| 624.471440252307 | 0 |
| 624.8608028657088 | 0 |
| 625.2501654791107 | 0 |
| 625.6395280925126 | 0 |
| 626.0288907059145 | 0 |
| 626.4182533193162 | 0 |
| 626.8076159327181 | 0 |
| 627.19697854612 | 0 |
| 627.5863411595219 | 0 |
| 627.9757037729238 | 0 |
| 628.3650663863256 | 0 |
| 628.7544289997275 | 0 |
| 629.1437916131293 | 0 |
| 629.5331542265312 | 0 |
| 629.922516839933 | 0 |
| 630.3118794533349 | 0 |
| 630.7012420667368 | 0 |
| 631.0906046801387 | 0 |
| 631.4799672935405 | 0 |
| 631.8693299069423 | 0 |
| 632.2586925203442 | 0 |
| 632.6480551337461 | 0 |
| 633.037417747148 | 0 |
| 633.4267803605499 | 0 |
| 633.8161429739516 | 0 |
| 634.2055055873535 | 0 |
| 634.5948682007554 | 0 |
| 634.9842308141573 | 0 |
| 635.3735934275591 | 0 |
| 635.762956040961 | 0 |
| 636.1523186543628 | 0 |
| 636.5416812677647 | 0 |
| 636.9310438811666 | 0 |
| 637.3204064945684 | 0 |
| 637.7097691079703 | 0 |
| 638.0991317213721 | 0 |
| 638.488494334774 | 0 |
| 638.8778569481758 | 0 |
| 639.2672195615777 | 0 |
| 639.6565821749796 | 0 |
| 640.0459447883815 | 0 |
| 640.4353074017833 | 0 |
| 640.8246700151851 | 0 |
| 641.214032628587 | 0 |
| 641.6033952419889 | 0 |
| 641.9927578553908 | 0 |
| 642.3821204687926 | 0 |
| 642.7714830821944 | 0 |
| 643.1608456955963 | 0 |
| 643.5502083089982 | 0 |
| 643.9395709224001 | 0 |
| 644.3289335358019 | 0 |
| 644.7182961492038 | 0 |
| 645.1076587626056 | 0 |
| 645.4970213760075 | 0 |
| 645.8863839894094 | 0 |
| 646.2757466028112 | 0 |
| 646.6651092162131 | 0 |
| 647.054471829615 | 0 |
| 647.4438344430168 | 0 |
| 647.8331970564186 | 0 |
| 648.2225596698205 | 0 |
| 648.6119222832224 | 0 |
| 649.0012848966243 | 0 |
| 649.3906475100262 | 0 |
| 649.7800101234279 | 0 |
| 650.1693727368298 | 0 |
| 650.5587353502317 | 0 |
| 650.9480979636336 | 0 |
| 651.3374605770354 | 0 |
| 651.7268231904372 | 0 |
| 652.1161858038391 | 0 |
| 652.505548417241 | 0 |
| 652.8949110306429 | 0 |
| 653.2842736440447 | 0 |
| 653.6736362574466 | 0 |
| 654.0629988708484 | 0 |
| 654.4523614842503 | 0 |
| 654.8417240976522 | 0 |
| 655.231086711054 | 0 |
| 655.6204493244559 | 0 |
| 656.0098119378578 | 0 |
| 656.3991745512596 | 0 |
| 656.7885371646614 | 0 |
| 657.1778997780633 | 0 |
| 657.5672623914652 | 0 |
| 657.9566250048671 | 0 |
| 658.345987618269 | 0 |
| 658.7353502316707 | 0 |
| 659.1247128450726 | 0 |
| 659.5140754584745 | 0 |
| 659.9034380718764 | 0 |
| 660.2928006852782 | 0 |
| 660.68216329868 | 0 |
| 661.0715259120819 | 0 |
| 661.4608885254838 | 0 |
| 661.8502511388857 | 0 |
| 662.2396137522875 | 0 |
| 662.6289763656894 | 0 |
| 663.0183389790913 | 0 |
| 663.4077015924931 | 0 |
| 663.797064205895 | 0 |
| 664.1864268192968 | 0 |
| 664.5757894326987 | 0 |
| 664.9651520461006 | 0 |
| 665.3545146595025 | 0 |
| 665.7438772729042 | 0 |
| 666.1332398863061 | 0 |
| 666.522602499708 | 0 |
| 666.9119651131099 | 0 |
| 667.3013277265118 | 0 |
| 667.6906903399135 | 0 |
| 668.0800529533154 | 0 |
| 668.4694155667173 | 0 |
| 668.8587781801192 | 0 |
| 669.248140793521 | 0 |
| 669.6375034069229 | 0 |
| 670.0268660203247 | 0 |
| 670.4162286337266 | 0 |
| 670.8055912471285 | 0 |
| 671.1949538605303 | 0 |
| 671.5843164739322 | 0 |
| 671.9736790873341 | 0 |
| 672.363041700736 | 0 |
| 672.7524043141378 | 0 |
| 673.1417669275396 | 0 |
| 673.5311295409415 | 0 |
| 673.9204921543434 | 0 |
| 674.3098547677453 | 0 |
| 674.699217381147 | 0 |
| 675.0885799945489 | 0 |
| 675.4779426079508 | 0 |
| 675.8673052213527 | 0 |
| 676.2566678347546 | 0 |
| 676.6460304481564 | 0 |
| 677.0353930615582 | 0 |
| 677.4247556749601 | 0 |
| 677.814118288362 | 0 |
| 678.2034809017638 | 0 |
| 678.5928435151657 | 0 |
| 678.9822061285676 | 0 |
| 679.3715687419694 | 0 |
| 679.7609313553713 | 0 |
| 680.1502939687731 | 0 |
| 680.539656582175 | 0 |
| 680.9290191955769 | 0 |
| 681.3183818089788 | 0 |
| 681.7077444223806 | 0 |
| 682.0971070357824 | 0 |
| 682.4864696491843 | 0 |
| 682.8758322625862 | 0 |
| 683.2651948759881 | 0 |
| 683.6545574893898 | 0 |
| 684.0439201027917 | 0 |
| 684.4332827161936 | 0 |
| 684.8226453295955 | 0 |
| 685.2120079429974 | 0 |
| 685.6013705563992 | 0 |
| 685.990733169801 | 0 |
| 686.3800957832029 | 0 |
| 686.7694583966048 | 0 |
| 687.1588210100066 | 0 |
| 687.5481836234085 | 0 |
| 687.9375462368104 | 0 |
| 688.3269088502122 | 0 |
| 688.7162714636141 | 0 |
| 689.1056340770159 | 0 |
| 689.4949966904178 | 0 |
| 689.8843593038197 | 0 |
| 690.2737219172216 | 0 |
| 690.6630845306233 | 0 |
| 691.0524471440252 | 0 |
| 691.4418097574271 | 0 |
| 691.831172370829 | 0 |
| 692.2205349842309 | 0 |
| 692.6098975976327 | 0 |
| 692.9992602110345 | 0 |
| 693.3886228244364 | 0 |
| 693.7779854378383 | 0 |
| 694.1673480512402 | 0 |
| 694.556710664642 | 0 |
| 694.9460732780439 | 0 |
| 695.3354358914457 | 0 |
| 695.7247985048476 | 0 |
| 696.1141611182494 | 0 |
| 696.5035237316513 | 0 |
| 696.8928863450532 | 0 |
| 697.282248958455 | 0 |
| 697.6716115718569 | 0 |
| 698.0609741852587 | 0 |
| 698.4503367986606 | 0 |
| 698.8396994120625 | 0 |
| 699.2290620254644 | 0 |
| 699.6184246388661 | 0 |
| 700.007787252268 | 0 |